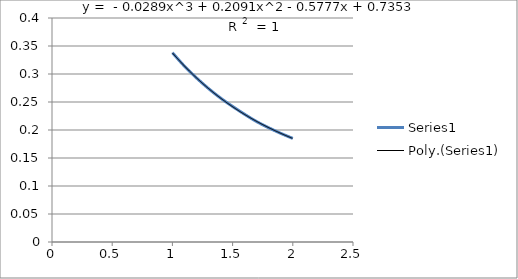
| Category | Series 0 |
|---|---|
| 1.0 | 0.338 |
| 1.1 | 0.314 |
| 1.2 | 0.293 |
| 1.3 | 0.274 |
| 1.4 | 0.257 |
| 1.5 | 0.242 |
| 1.6 | 0.228 |
| 1.7 | 0.215 |
| 1.8 | 0.204 |
| 1.9 | 0.194 |
| 2.0 | 0.185 |